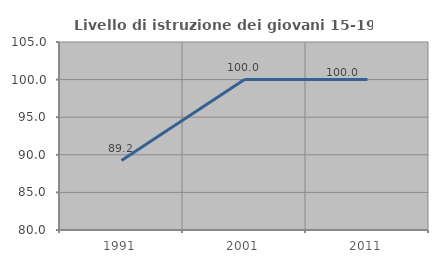
| Category | Livello di istruzione dei giovani 15-19 anni |
|---|---|
| 1991.0 | 89.231 |
| 2001.0 | 100 |
| 2011.0 | 100 |